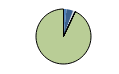
| Category | Series 0 |
|---|---|
| ARRASTRE | 15 |
| CERCO | 32 |
| ATUNEROS CAÑEROS | 2 |
| PALANGRE DE FONDO | 6 |
| PALANGRE DE SUPERFICIE | 4 |
| RASCO | 0 |
| VOLANTA | 1 |
| ARTES FIJAS | 0 |
| ARTES MENORES | 789 |